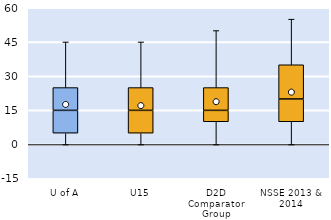
| Category | 25th | 50th | 75th |
|---|---|---|---|
| U of A | 5 | 10 | 10 |
| U15 | 5 | 10 | 10 |
| D2D Comparator Group | 10 | 5 | 10 |
| NSSE 2013 & 2014 | 10 | 10 | 15 |